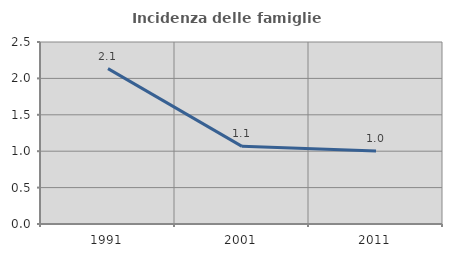
| Category | Incidenza delle famiglie numerose |
|---|---|
| 1991.0 | 2.134 |
| 2001.0 | 1.067 |
| 2011.0 | 1.001 |